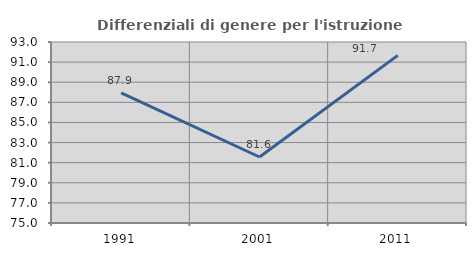
| Category | Differenziali di genere per l'istruzione superiore |
|---|---|
| 1991.0 | 87.938 |
| 2001.0 | 81.563 |
| 2011.0 | 91.669 |